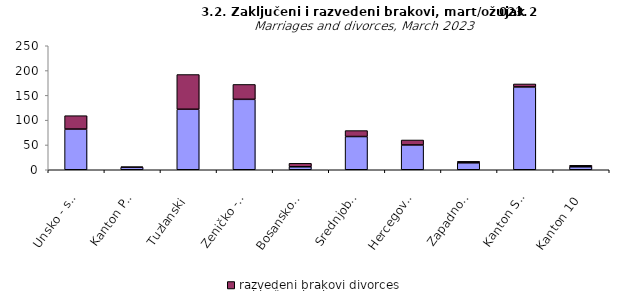
| Category | zaključeni brakovi marriages | razvedeni brakovi divorces |
|---|---|---|
| Unsko - sanski | 82 | 27 |
| Kanton Posavski | 5 | 1 |
| Tuzlanski | 122 | 70 |
| Zeničko - dobojski | 142 | 30 |
| Bosansko - podrinjski | 6 | 7 |
| Srednjobosanski | 67 | 12 |
| Hercegovačko-neretvanski | 50 | 10 |
| Zapadnohercegovački | 14 | 3 |
| Kanton Sarajevo | 167 | 6 |
| Kanton 10 | 6 | 3 |